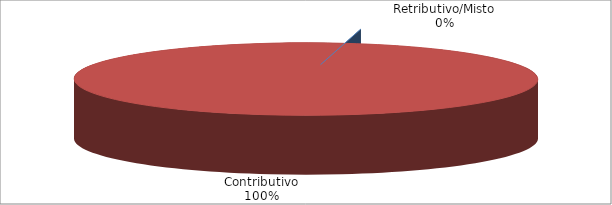
| Category | Series 1 |
|---|---|
| Retributivo/Misto | 0 |
| Contributivo | 19495 |